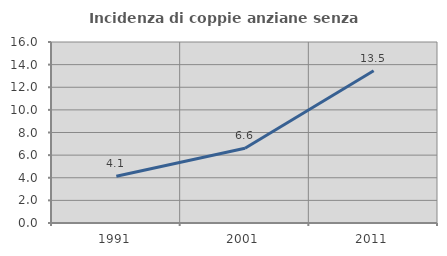
| Category | Incidenza di coppie anziane senza figli  |
|---|---|
| 1991.0 | 4.126 |
| 2001.0 | 6.601 |
| 2011.0 | 13.452 |